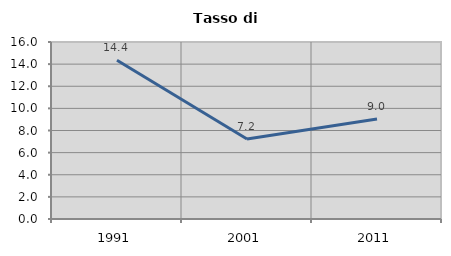
| Category | Tasso di disoccupazione   |
|---|---|
| 1991.0 | 14.356 |
| 2001.0 | 7.237 |
| 2011.0 | 9.045 |